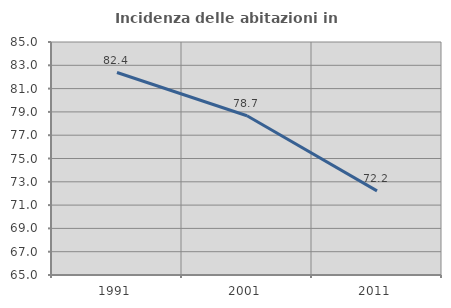
| Category | Incidenza delle abitazioni in proprietà  |
|---|---|
| 1991.0 | 82.382 |
| 2001.0 | 78.667 |
| 2011.0 | 72.222 |